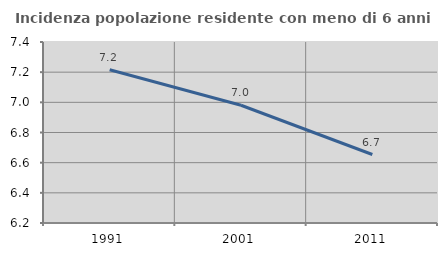
| Category | Incidenza popolazione residente con meno di 6 anni |
|---|---|
| 1991.0 | 7.216 |
| 2001.0 | 6.981 |
| 2011.0 | 6.654 |